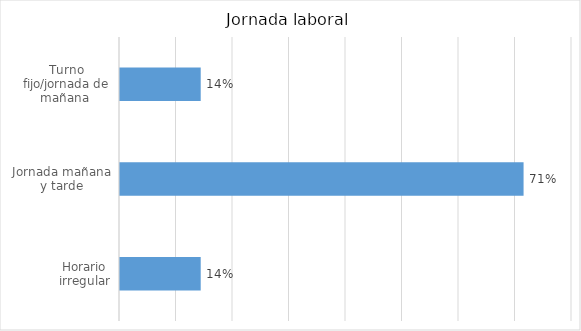
| Category | Series 0 |
|---|---|
| Horario irregular | 0.143 |
| Jornada mañana y tarde | 0.714 |
| Turno fijo/jornada de mañana  | 0.143 |